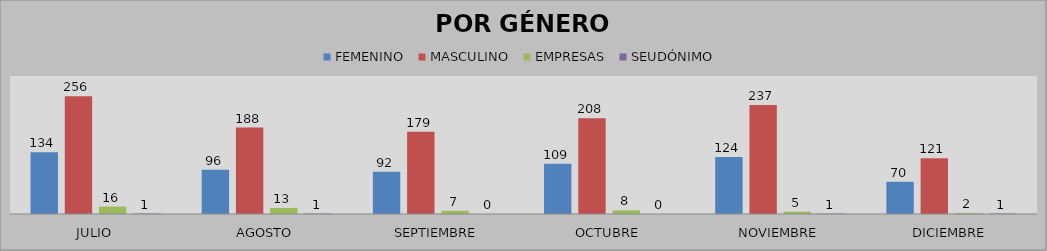
| Category | FEMENINO | MASCULINO | EMPRESAS | SEUDÓNIMO |
|---|---|---|---|---|
| JULIO | 134 | 256 | 16 | 1 |
| AGOSTO | 96 | 188 | 13 | 1 |
| SEPTIEMBRE | 92 | 179 | 7 | 0 |
| OCTUBRE | 109 | 208 | 8 | 0 |
| NOVIEMBRE | 124 | 237 | 5 | 1 |
| DICIEMBRE | 70 | 121 | 2 | 1 |